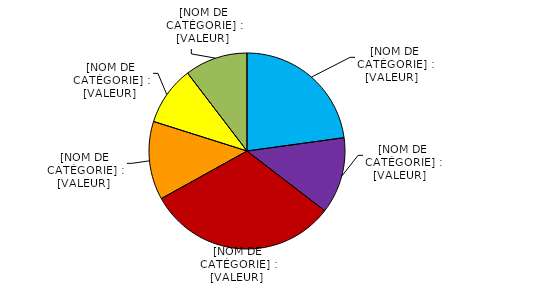
| Category | Series 0 |
|---|---|
| Restauration | 0.228 |
| Logement | 0.126 |
| Familles, vacances  | 0.315 |
| Mutuelles, associations | 0.129 |
| Prévention et secours | 0.098 |
| Autre | 0.104 |